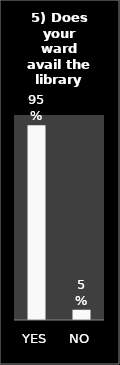
| Category | Series 0 |
|---|---|
| YES | 0.95 |
| NO | 0.05 |